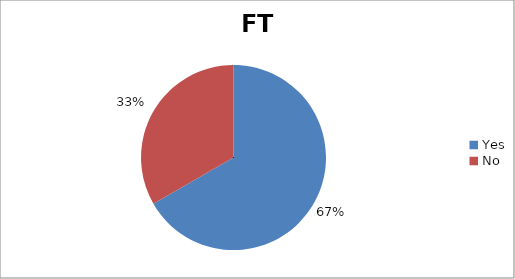
| Category | FT Resident |
|---|---|
| Yes | 2 |
| No | 1 |